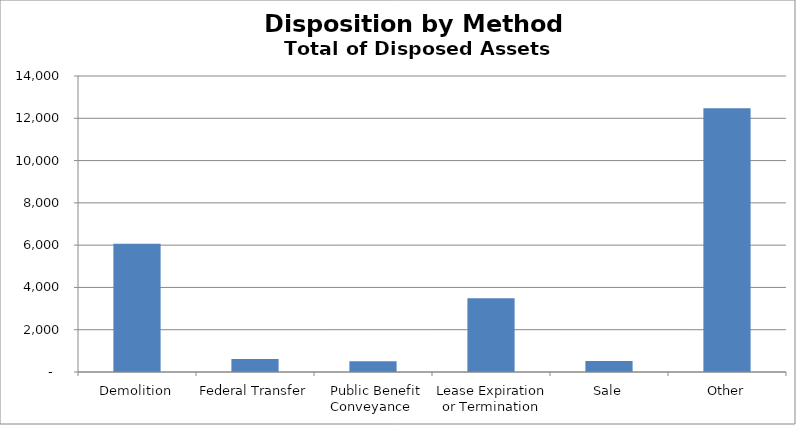
| Category | Series 0 |
|---|---|
| Demolition | 6066 |
| Federal Transfer | 610 |
| Public Benefit Conveyance | 510 |
| Lease Expiration or Termination | 3487 |
| Sale | 515 |
| Other | 12475 |